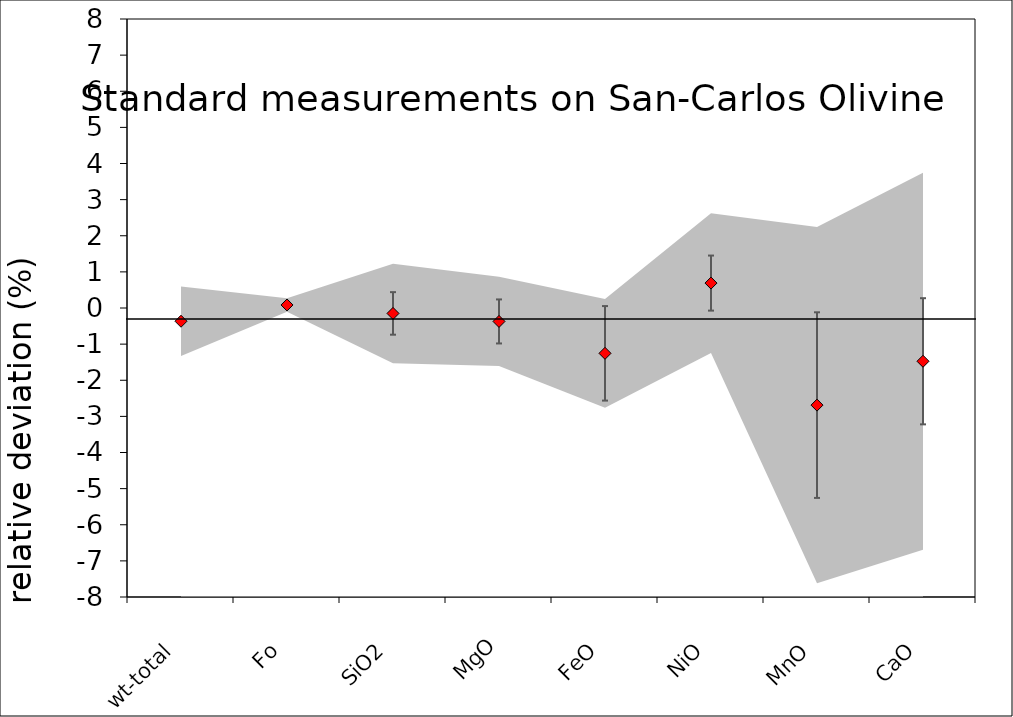
| Category | Series 0 |
|---|---|
| wt-total | -0.367 |
| Fo | 0.084 |
| SiO2 | -0.15 |
| MgO | -0.372 |
| FeO | -1.255 |
| NiO | 0.69 |
| MnO | -2.688 |
| CaO | -1.475 |